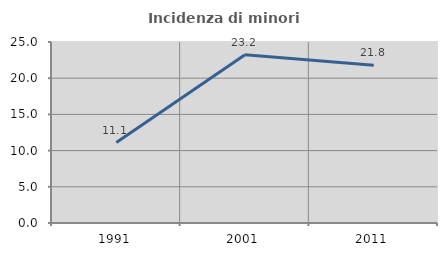
| Category | Incidenza di minori stranieri |
|---|---|
| 1991.0 | 11.111 |
| 2001.0 | 23.243 |
| 2011.0 | 21.777 |